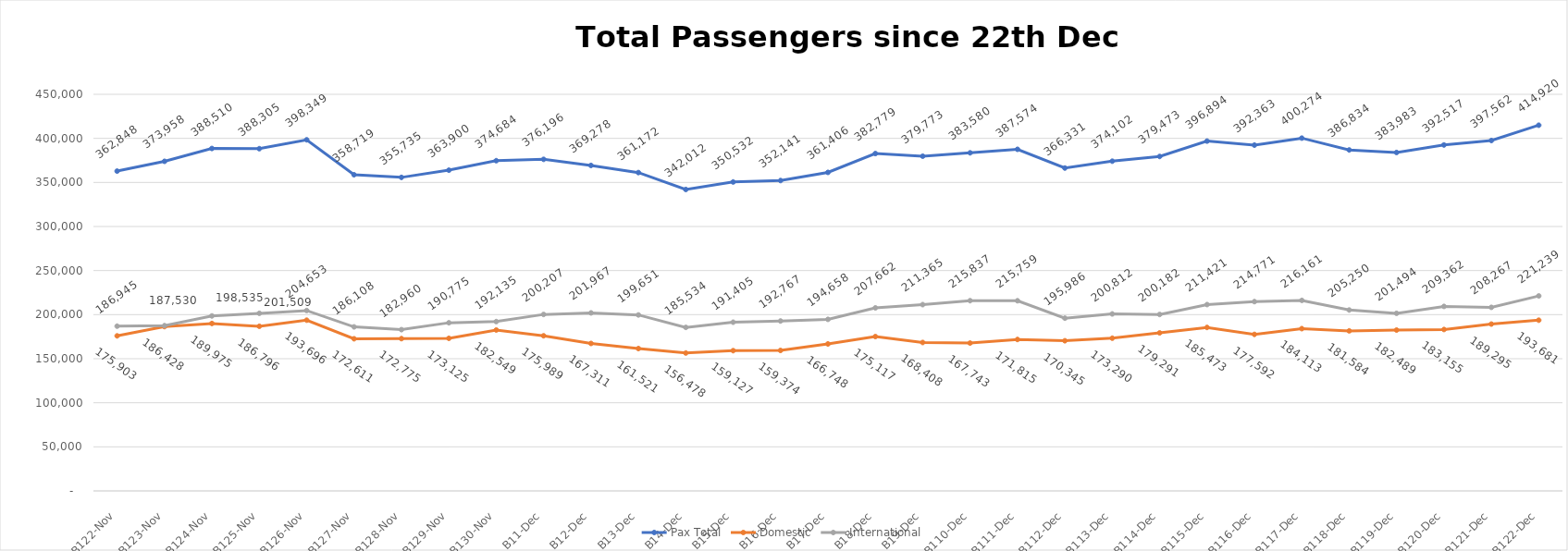
| Category | Pax Total | Domestic | International |
|---|---|---|---|
| 2023-11-22 | 362848 | 175903 | 186945 |
| 2023-11-23 | 373958 | 186428 | 187530 |
| 2023-11-24 | 388510 | 189975 | 198535 |
| 2023-11-25 | 388305 | 186796 | 201509 |
| 2023-11-26 | 398349 | 193696 | 204653 |
| 2023-11-27 | 358719 | 172611 | 186108 |
| 2023-11-28 | 355735 | 172775 | 182960 |
| 2023-11-29 | 363900 | 173125 | 190775 |
| 2023-11-30 | 374684 | 182549 | 192135 |
| 2023-12-01 | 376196 | 175989 | 200207 |
| 2023-12-02 | 369278 | 167311 | 201967 |
| 2023-12-03 | 361172 | 161521 | 199651 |
| 2023-12-04 | 342012 | 156478 | 185534 |
| 2023-12-05 | 350532 | 159127 | 191405 |
| 2023-12-06 | 352141 | 159374 | 192767 |
| 2023-12-07 | 361406 | 166748 | 194658 |
| 2023-12-08 | 382779 | 175117 | 207662 |
| 2023-12-09 | 379773 | 168408 | 211365 |
| 2023-12-10 | 383580 | 167743 | 215837 |
| 2023-12-11 | 387574 | 171815 | 215759 |
| 2023-12-12 | 366331 | 170345 | 195986 |
| 2023-12-13 | 374102 | 173290 | 200812 |
| 2023-12-14 | 379473 | 179291 | 200182 |
| 2023-12-15 | 396894 | 185473 | 211421 |
| 2023-12-16 | 392363 | 177592 | 214771 |
| 2023-12-17 | 400274 | 184113 | 216161 |
| 2023-12-18 | 386834 | 181584 | 205250 |
| 2023-12-19 | 383983 | 182489 | 201494 |
| 2023-12-20 | 392517 | 183155 | 209362 |
| 2023-12-21 | 397562 | 189295 | 208267 |
| 2023-12-22 | 414920 | 193681 | 221239 |